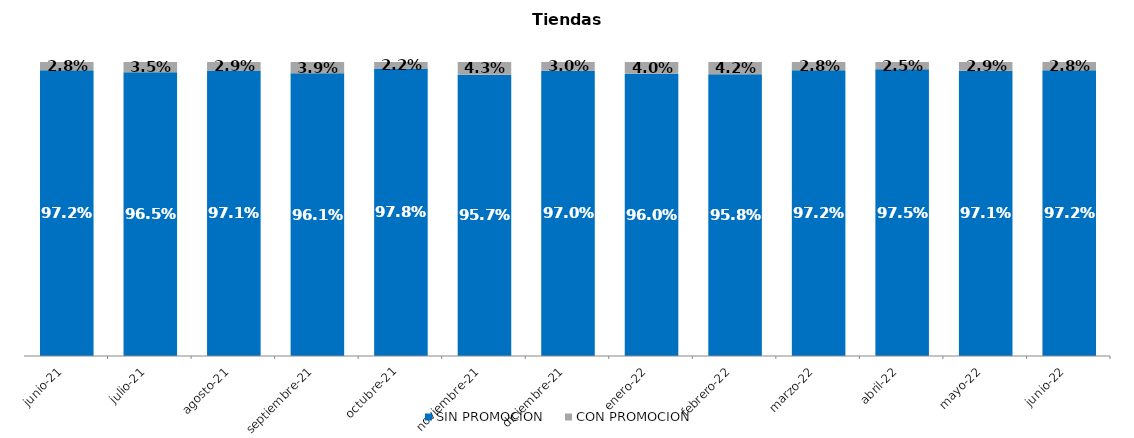
| Category | SIN PROMOCION   | CON PROMOCION   |
|---|---|---|
| 2021-06-01 | 0.972 | 0.028 |
| 2021-07-01 | 0.965 | 0.035 |
| 2021-08-01 | 0.971 | 0.029 |
| 2021-09-01 | 0.961 | 0.039 |
| 2021-10-01 | 0.978 | 0.022 |
| 2021-11-01 | 0.957 | 0.043 |
| 2021-12-01 | 0.97 | 0.03 |
| 2022-01-01 | 0.96 | 0.04 |
| 2022-02-01 | 0.958 | 0.042 |
| 2022-03-01 | 0.972 | 0.028 |
| 2022-04-01 | 0.975 | 0.025 |
| 2022-05-01 | 0.971 | 0.029 |
| 2022-06-01 | 0.972 | 0.028 |